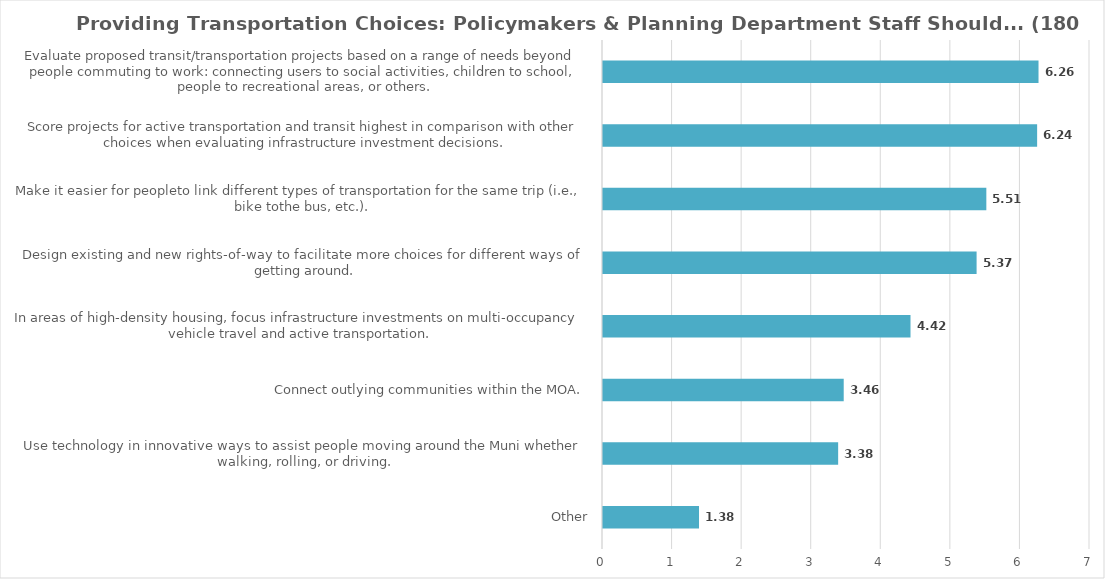
| Category | Score |
|---|---|
| Other | 1.38 |
| Use technology in innovative ways to assist people moving around the Muni whether walking, rolling, or driving. | 3.38 |
| Connect outlying communities within the MOA. | 3.46 |
| In areas of high-density housing, focus infrastructure investments on multi-occupancy vehicle travel and active transportation. | 4.42 |
| Design existing and new rights-of-way to facilitate more choices for different ways of getting around. | 5.37 |
| Make it easier for peopleto link different types of transportation for the same trip (i.e., bike tothe bus, etc.). | 5.51 |
| Score projects for active transportation and transit highest in comparison with other choices when evaluating infrastructure investment decisions. | 6.24 |
| Evaluate proposed transit/transportation projects based on a range of needs beyond people commuting to work: connecting users to social activities, children to school, people to recreational areas, or others. | 6.26 |